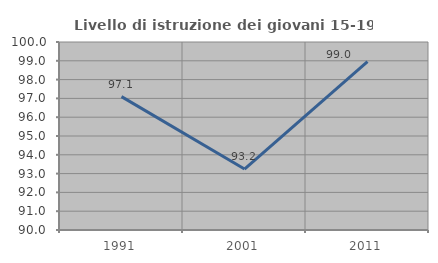
| Category | Livello di istruzione dei giovani 15-19 anni |
|---|---|
| 1991.0 | 97.093 |
| 2001.0 | 93.243 |
| 2011.0 | 98.953 |